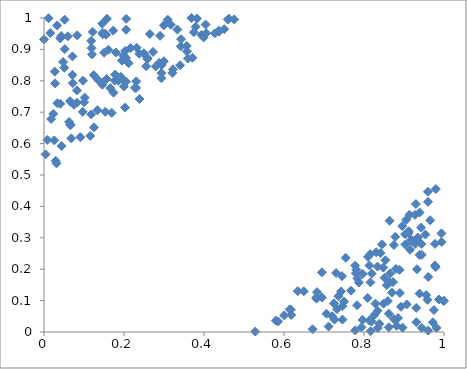
| Category | Series 0 |
|---|---|
| 0.8255359253217334 | 0.054 |
| -1.0 | -1 |
| -1.0 | -1 |
| -1.0 | -1 |
| -1.0 | -1 |
| -1.0 | -1 |
| -1.0 | -1 |
| 0.043009173144423984 | 0.943 |
| -1.0 | -1 |
| -1.0 | -1 |
| -1.0 | -1 |
| 0.8164118752493941 | 0.003 |
| -1.0 | -1 |
| 0.9032480513270551 | 0.279 |
| -1.0 | -1 |
| -1.0 | -1 |
| 0.06540548000652446 | 0.659 |
| -1.0 | -1 |
| -1.0 | -1 |
| -1.0 | -1 |
| -1.0 | -1 |
| -1.0 | -1 |
| -1.0 | -1 |
| 0.27939391772319966 | 0.846 |
| 0.14563416849404653 | 0.982 |
| -1.0 | -1 |
| 0.9306574972074495 | 0.077 |
| -1.0 | -1 |
| -1.0 | -1 |
| -1.0 | -1 |
| -1.0 | -1 |
| -1.0 | -1 |
| -1.0 | -1 |
| -1.0 | -1 |
| -1.0 | -1 |
| 0.39402318327530317 | 0.946 |
| -1.0 | -1 |
| 0.8746428690441705 | 0.041 |
| -1.0 | -1 |
| -1.0 | -1 |
| 0.8780425017900186 | 0.303 |
| -1.0 | -1 |
| -1.0 | -1 |
| -1.0 | -1 |
| 0.9443025398904694 | 0.246 |
| 0.881739866000679 | 0.02 |
| -1.0 | -1 |
| 0.05069709843471282 | 0.841 |
| -1.0 | -1 |
| -1.0 | -1 |
| 0.16576871503456592 | 0.777 |
| 0.9117610406502341 | 0.321 |
| -1.0 | -1 |
| -1.0 | -1 |
| -1.0 | -1 |
| -1.0 | -1 |
| -1.0 | -1 |
| -1.0 | -1 |
| -1.0 | -1 |
| -1.0 | -1 |
| -1.0 | -1 |
| 0.8964391469760449 | 0.014 |
| -1.0 | -1 |
| -1.0 | -1 |
| -1.0 | -1 |
| -1.0 | -1 |
| -1.0 | -1 |
| -1.0 | -1 |
| -1.0 | -1 |
| 0.19479838299463048 | 0.864 |
| -1.0 | -1 |
| 0.1730308627314714 | 0.96 |
| -1.0 | -1 |
| -1.0 | -1 |
| -1.0 | -1 |
| -1.0 | -1 |
| -1.0 | -1 |
| -1.0 | -1 |
| -1.0 | -1 |
| -1.0 | -1 |
| -1.0 | -1 |
| -1.0 | -1 |
| -1.0 | -1 |
| -1.0 | -1 |
| -1.0 | -1 |
| -1.0 | -1 |
| -1.0 | -1 |
| -1.0 | -1 |
| -1.0 | -1 |
| -1.0 | -1 |
| 0.3685224188958687 | 1 |
| -1.0 | -1 |
| 0.8955345021895946 | 0.337 |
| -1.0 | -1 |
| 0.00396515235492112 | 0.566 |
| -1.0 | -1 |
| -1.0 | -1 |
| 0.8889086364307159 | 0.198 |
| -1.0 | -1 |
| -1.0 | -1 |
| -1.0 | -1 |
| -1.0 | -1 |
| 0.18606198860519307 | 0.8 |
| 0.9934877384595246 | 0.314 |
| -1.0 | -1 |
| -1.0 | -1 |
| 0.9534184793362366 | 0.31 |
| -1.0 | -1 |
| -1.0 | -1 |
| -1.0 | -1 |
| -1.0 | -1 |
| -1.0 | -1 |
| 0.8132427247512573 | 0.037 |
| 0.15520126695969738 | 0.947 |
| -1.0 | -1 |
| 0.07372300051331626 | 0.726 |
| -1.0 | -1 |
| -1.0 | -1 |
| -1.0 | -1 |
| -1.0 | -1 |
| -1.0 | -1 |
| -1.0 | -1 |
| -1.0 | -1 |
| -1.0 | -1 |
| -1.0 | -1 |
| -1.0 | -1 |
| -1.0 | -1 |
| -1.0 | -1 |
| -1.0 | -1 |
| -1.0 | -1 |
| -1.0 | -1 |
| -1.0 | -1 |
| 0.7778610527372507 | 0.211 |
| -1.0 | -1 |
| -1.0 | -1 |
| 0.12489773113892699 | 0.652 |
| -1.0 | -1 |
| -1.0 | -1 |
| 0.2882715653145702 | 0.857 |
| -1.0 | -1 |
| -1.0 | -1 |
| -1.0 | -1 |
| -1.0 | -1 |
| 0.18920519381020595 | 0.804 |
| -1.0 | -1 |
| -1.0 | -1 |
| -1.0 | -1 |
| -1.0 | -1 |
| -1.0 | -1 |
| -1.0 | -1 |
| -1.0 | -1 |
| -1.0 | -1 |
| -1.0 | -1 |
| -1.0 | -1 |
| -1.0 | -1 |
| -1.0 | -1 |
| 0.3402747191488098 | 0.85 |
| -1.0 | -1 |
| -1.0 | -1 |
| -1.0 | -1 |
| -1.0 | -1 |
| -1.0 | -1 |
| -1.0 | -1 |
| -1.0 | -1 |
| -1.0 | -1 |
| 0.06489532293004885 | 0.735 |
| 0.9152704273472629 | 0.262 |
| 0.07111684465113921 | 0.819 |
| 0.7810111411751415 | 0.198 |
| -1.0 | -1 |
| 0.9435003015772141 | 0.28 |
| 0.8727521123040052 | 0.159 |
| -1.0 | -1 |
| 0.204939336731349 | 0.873 |
| 0.11581418679008104 | 0.625 |
| 0.9794280628973109 | 0.455 |
| -1.0 | -1 |
| -1.0 | -1 |
| -1.0 | -1 |
| -1.0 | -1 |
| -1.0 | -1 |
| 0.011304860166733821 | 0.999 |
| -1.0 | -1 |
| -1.0 | -1 |
| -1.0 | -1 |
| 0.8414668373654604 | 0.252 |
| -1.0 | -1 |
| 0.9391388847419431 | 0.381 |
| -1.0 | -1 |
| -1.0 | -1 |
| -1.0 | -1 |
| -1.0 | -1 |
| -1.0 | -1 |
| -1.0 | -1 |
| -1.0 | -1 |
| -1.0 | -1 |
| -1.0 | -1 |
| 0.37477566555972697 | 0.955 |
| 0.8336921301989797 | 0.208 |
| -1.0 | -1 |
| -1.0 | -1 |
| -1.0 | -1 |
| -1.0 | -1 |
| -1.0 | -1 |
| -1.0 | -1 |
| -1.0 | -1 |
| -1.0 | -1 |
| -1.0 | -1 |
| -1.0 | -1 |
| 0.6946987735963885 | 0.19 |
| -1.0 | -1 |
| -1.0 | -1 |
| -1.0 | -1 |
| 0.8339553074898127 | 0.067 |
| -1.0 | -1 |
| -1.0 | -1 |
| 0.9274862772767005 | 0.373 |
| -1.0 | -1 |
| -1.0 | -1 |
| -1.0 | -1 |
| -1.0 | -1 |
| -1.0 | -1 |
| -1.0 | -1 |
| -1.0 | -1 |
| -1.0 | -1 |
| -1.0 | -1 |
| 0.42697579692343446 | 0.951 |
| -1.0 | -1 |
| -1.0 | -1 |
| -1.0 | -1 |
| -1.0 | -1 |
| 0.3823107654467215 | 0.998 |
| -1.0 | -1 |
| 0.8383973170512524 | 0.026 |
| -1.0 | -1 |
| -1.0 | -1 |
| 0.14577978334024477 | 0.787 |
| -1.0 | -1 |
| -1.0 | -1 |
| 0.11810275844841822 | 0.693 |
| 0.25855494437174187 | 0.874 |
| -1.0 | -1 |
| -1.0 | -1 |
| 0.7937795830727383 | 0.015 |
| 0.16104514370522827 | 0.899 |
| -1.0 | -1 |
| -1.0 | -1 |
| -1.0 | -1 |
| 0.20302255121564183 | 0.895 |
| -1.0 | -1 |
| -1.0 | -1 |
| -1.0 | -1 |
| 0.238211186891637 | 0.886 |
| -1.0 | -1 |
| -1.0 | -1 |
| -1.0 | -1 |
| -1.0 | -1 |
| -1.0 | -1 |
| -1.0 | -1 |
| 0.3334892592455265 | 0.963 |
| -1.0 | -1 |
| -1.0 | -1 |
| 0.879962578920618 | 0.201 |
| 0.09685444831872614 | 0.701 |
| 0.7834100510101489 | 0.17 |
| -1.0 | -1 |
| -1.0 | -1 |
| -1.0 | -1 |
| -1.0 | -1 |
| -1.0 | -1 |
| -1.0 | -1 |
| -1.0 | -1 |
| -1.0 | -1 |
| -1.0 | -1 |
| -1.0 | -1 |
| -1.0 | -1 |
| -1.0 | -1 |
| -1.0 | -1 |
| -1.0 | -1 |
| -1.0 | -1 |
| -1.0 | -1 |
| 0.5852286284827777 | 0.034 |
| -1.0 | -1 |
| -1.0 | -1 |
| 0.19975987653984673 | 0.782 |
| -1.0 | -1 |
| -1.0 | -1 |
| -1.0 | -1 |
| -1.0 | -1 |
| -1.0 | -1 |
| 0.8570411835558094 | 0.149 |
| 0.9111200701835056 | 0.315 |
| -1.0 | -1 |
| -1.0 | -1 |
| -1.0 | -1 |
| -1.0 | -1 |
| -1.0 | -1 |
| 0.07494091043624396 | 0.724 |
| -1.0 | -1 |
| -1.0 | -1 |
| -1.0 | -1 |
| 0.4506421320639138 | 0.964 |
| 0.7778265660566588 | 0.005 |
| -1.0 | -1 |
| -1.0 | -1 |
| -1.0 | -1 |
| -1.0 | -1 |
| -1.0 | -1 |
| -1.0 | -1 |
| 0.1503177257202437 | 0.89 |
| -1.0 | -1 |
| -1.0 | -1 |
| -1.0 | -1 |
| 0.9941526374245395 | 0.287 |
| 0.37890189670716046 | 0.972 |
| -1.0 | -1 |
| 0.2049105972567511 | 0.797 |
| 0.9281396448241139 | 0.28 |
| -1.0 | -1 |
| 0.08231046268248865 | 0.769 |
| -1.0 | -1 |
| -1.0 | -1 |
| -1.0 | -1 |
| -1.0 | -1 |
| -1.0 | -1 |
| -1.0 | -1 |
| -1.0 | -1 |
| -1.0 | -1 |
| 0.5794780751692681 | 0.036 |
| -1.0 | -1 |
| -1.0 | -1 |
| -1.0 | -1 |
| -1.0 | -1 |
| -1.0 | -1 |
| -1.0 | -1 |
| -1.0 | -1 |
| -1.0 | -1 |
| 0.23056741628636246 | 0.798 |
| 0.7449419577818155 | 0.178 |
| -1.0 | -1 |
| -1.0 | -1 |
| 0.6714475108426692 | 0.009 |
| -1.0 | -1 |
| -1.0 | -1 |
| -1.0 | -1 |
| -1.0 | -1 |
| -1.0 | -1 |
| -1.0 | -1 |
| 0.16950391643711704 | 0.698 |
| -1.0 | -1 |
| -1.0 | -1 |
| -1.0 | -1 |
| 0.7425621731814784 | 0.129 |
| 0.3991742757075434 | 0.938 |
| -1.0 | -1 |
| -1.0 | -1 |
| 0.9183824143746451 | 0.294 |
| -1.0 | -1 |
| -1.0 | -1 |
| 0.754252043697963 | 0.236 |
| -1.0 | -1 |
| -1.0 | -1 |
| 0.9134960990707608 | 0.373 |
| 0.6006186959241964 | 0.053 |
| -1.0 | -1 |
| 0.23179550634821933 | 0.905 |
| 0.17771714088133406 | 0.82 |
| -1.0 | -1 |
| 0.9388576189557858 | 0.122 |
| -1.0 | -1 |
| -1.0 | -1 |
| -1.0 | -1 |
| -1.0 | -1 |
| -1.0 | -1 |
| 0.37104994469427677 | 0.873 |
| 0.8481428289582214 | 0.205 |
| 0.15644086167815474 | 0.806 |
| 0.7963588384566727 | 0.039 |
| -1.0 | -1 |
| -1.0 | -1 |
| -1.0 | -1 |
| -1.0 | -1 |
| 0.8516499930531218 | 0.173 |
| -1.0 | -1 |
| -1.0 | -1 |
| 0.040950726884403155 | 0.727 |
| -1.0 | -1 |
| -1.0 | -1 |
| 0.05143959658894115 | 0.995 |
| -1.0 | -1 |
| -1.0 | -1 |
| -1.0 | -1 |
| -1.0 | -1 |
| 0.4621325295219254 | 0.998 |
| -1.0 | -1 |
| -1.0 | -1 |
| -1.0 | -1 |
| 0.8595849178056165 | 0.098 |
| 0.8189425461002875 | 0.034 |
| -1.0 | -1 |
| -1.0 | -1 |
| -1.0 | -1 |
| -1.0 | -1 |
| -1.0 | -1 |
| -1.0 | -1 |
| -1.0 | -1 |
| -1.0 | -1 |
| 0.20526708608610456 | 0.963 |
| -1.0 | -1 |
| -1.0 | -1 |
| -1.0 | -1 |
| -1.0 | -1 |
| -1.0 | -1 |
| 0.979176126875215 | 0.207 |
| -1.0 | -1 |
| 0.2584566786253444 | 0.869 |
| -1.0 | -1 |
| -1.0 | -1 |
| 0.848854436947055 | 0.09 |
| -1.0 | -1 |
| -1.0 | -1 |
| -1.0 | -1 |
| -1.0 | -1 |
| -1.0 | -1 |
| -1.0 | -1 |
| 0.29412721051438306 | 0.85 |
| 0.17684557205700013 | 0.8 |
| 0.21168021146996896 | 0.856 |
| -1.0 | -1 |
| -1.0 | -1 |
| -1.0 | -1 |
| -1.0 | -1 |
| -1.0 | -1 |
| -1.0 | -1 |
| -1.0 | -1 |
| -1.0 | -1 |
| -1.0 | -1 |
| -1.0 | -1 |
| -1.0 | -1 |
| 0.9346557496366279 | 0.301 |
| -1.0 | -1 |
| -1.0 | -1 |
| -1.0 | -1 |
| -1.0 | -1 |
| 0.04056822320084663 | 0.935 |
| -1.0 | -1 |
| -1.0 | -1 |
| -1.0 | -1 |
| 0.02687302504944533 | 0.829 |
| -1.0 | -1 |
| -1.0 | -1 |
| 0.9586743304409124 | 0.102 |
| -1.0 | -1 |
| -1.0 | -1 |
| -1.0 | -1 |
| -1.0 | -1 |
| -1.0 | -1 |
| -1.0 | -1 |
| -1.0 | -1 |
| 0.8850800356384925 | 0.045 |
| 0.06838572021616773 | 0.617 |
| -1.0 | -1 |
| 0.8646525173764523 | 0.158 |
| 0.06688406228131694 | 0.66 |
| -1.0 | -1 |
| -1.0 | -1 |
| -1.0 | -1 |
| -1.0 | -1 |
| -1.0 | -1 |
| -1.0 | -1 |
| -1.0 | -1 |
| -1.0 | -1 |
| -1.0 | -1 |
| -1.0 | -1 |
| 0.74582669800009 | 0.083 |
| -1.0 | -1 |
| 0.7301684626796154 | 0.188 |
| -1.0 | -1 |
| -1.0 | -1 |
| -1.0 | -1 |
| -1.0 | -1 |
| -1.0 | -1 |
| -1.0 | -1 |
| -1.0 | -1 |
| -1.0 | -1 |
| -1.0 | -1 |
| -1.0 | -1 |
| -1.0 | -1 |
| 0.3222211924164413 | 0.836 |
| -1.0 | -1 |
| -1.0 | -1 |
| 0.7062133575677623 | 0.058 |
| -1.0 | -1 |
| -1.0 | -1 |
| -1.0 | -1 |
| -1.0 | -1 |
| -1.0 | -1 |
| 0.12008856975966964 | 0.884 |
| -1.0 | -1 |
| 0.9874799503133578 | 0.104 |
| -1.0 | -1 |
| 0.1527180337104297 | 0.95 |
| 0.11786424162476639 | 0.927 |
| 0.6811362062669974 | 0.11 |
| -1.0 | -1 |
| 0.27271477402076894 | 0.892 |
| 0.8640067113674903 | 0.354 |
| -1.0 | -1 |
| -1.0 | -1 |
| -1.0 | -1 |
| -1.0 | -1 |
| 0.8924284961902411 | 0.08 |
| 0.8748622343688224 | 0.277 |
| -1.0 | -1 |
| -1.0 | -1 |
| -1.0 | -1 |
| 0.04765673780918167 | 0.86 |
| -1.0 | -1 |
| -1.0 | -1 |
| -1.0 | -1 |
| 0.9428733470917323 | 0.332 |
| -1.0 | -1 |
| -1.0 | -1 |
| -1.0 | -1 |
| -1.0 | -1 |
| -1.0 | -1 |
| -1.0 | -1 |
| -1.0 | -1 |
| -1.0 | -1 |
| -1.0 | -1 |
| 0.24966833761768403 | 0.888 |
| -1.0 | -1 |
| -1.0 | -1 |
| -1.0 | -1 |
| -1.0 | -1 |
| 0.023012625383297625 | 0.695 |
| -1.0 | -1 |
| -1.0 | -1 |
| -1.0 | -1 |
| -1.0 | -1 |
| 0.8345874624729781 | 0.013 |
| 0.7261935373081227 | 0.039 |
| -1.0 | -1 |
| -1.0 | -1 |
| -1.0 | -1 |
| -1.0 | -1 |
| -1.0 | -1 |
| -1.0 | -1 |
| -1.0 | -1 |
| -1.0 | -1 |
| -1.0 | -1 |
| -1.0 | -1 |
| 0.3574206633095627 | 0.894 |
| -1.0 | -1 |
| -1.0 | -1 |
| -1.0 | -1 |
| -1.0 | -1 |
| -1.0 | -1 |
| 0.6143265979911645 | 0.072 |
| -1.0 | -1 |
| -1.0 | -1 |
| -1.0 | -1 |
| 0.9598521789983763 | 0.447 |
| -1.0 | -1 |
| -1.0 | -1 |
| -1.0 | -1 |
| 0.9308485737883598 | 0.031 |
| -1.0 | -1 |
| -1.0 | -1 |
| -1.0 | -1 |
| -1.0 | -1 |
| 0.9388798783211891 | 0.246 |
| -1.0 | -1 |
| -1.0 | -1 |
| 0.35953264785208566 | 0.871 |
| -1.0 | -1 |
| -1.0 | -1 |
| -1.0 | -1 |
| -1.0 | -1 |
| -1.0 | -1 |
| 0.7323560700948599 | 0.073 |
| 0.027763214054153273 | 0.792 |
| -1.0 | -1 |
| -1.0 | -1 |
| -1.0 | -1 |
| -1.0 | -1 |
| 0.9600715777174511 | 0.415 |
| -1.0 | -1 |
| -1.0 | -1 |
| -1.0 | -1 |
| 0.2646322793315701 | 0.949 |
| -1.0 | -1 |
| 0.07113640619290718 | 0.878 |
| 0.0822677552647395 | 0.73 |
| -1.0 | -1 |
| -1.0 | -1 |
| -1.0 | -1 |
| -1.0 | -1 |
| -1.0 | -1 |
| -1.0 | -1 |
| -1.0 | -1 |
| 0.23874658998815423 | 0.742 |
| -1.0 | -1 |
| -1.0 | -1 |
| 0.4370640267146888 | 0.96 |
| -1.0 | -1 |
| 0.9555233874749796 | 0.118 |
| -1.0 | -1 |
| 0.03113454789644199 | 0.537 |
| -1.0 | -1 |
| 0.1017304747408736 | 0.746 |
| -1.0 | -1 |
| -1.0 | -1 |
| -1.0 | -1 |
| -1.0 | -1 |
| 0.9029854184210597 | 0.311 |
| -1.0 | -1 |
| -1.0 | -1 |
| -1.0 | -1 |
| -1.0 | -1 |
| -1.0 | -1 |
| -1.0 | -1 |
| 0.7797084253536781 | 0.187 |
| -1.0 | -1 |
| 0.9605420665751305 | 0.005 |
| 0.09747782273047867 | 0.8 |
| 0.6168020715700353 | 0.071 |
| 0.4594765969326531 | 0.995 |
| 0.2902287824746801 | 0.943 |
| -1.0 | -1 |
| -1.0 | -1 |
| -1.0 | -1 |
| -1.0 | -1 |
| -1.0 | -1 |
| -1.0 | -1 |
| -1.0 | -1 |
| 0.6345084766040774 | 0.13 |
| -1.0 | -1 |
| -1.0 | -1 |
| -1.0 | -1 |
| 0.7827128865170279 | 0.085 |
| -1.0 | -1 |
| 0.9721658937026252 | 0.031 |
| -1.0 | -1 |
| 0.025737310360779198 | 0.61 |
| -1.0 | -1 |
| -1.0 | -1 |
| -1.0 | -1 |
| 0.2554707678587307 | 0.846 |
| -1.0 | -1 |
| -1.0 | -1 |
| -1.0 | -1 |
| -1.0 | -1 |
| -1.0 | -1 |
| -1.0 | -1 |
| -1.0 | -1 |
| 0.14705967242826423 | 0.948 |
| -1.0 | -1 |
| -1.0 | -1 |
| -1.0 | -1 |
| 0.15313899072912474 | 0.701 |
| 0.13350103323083662 | 0.706 |
| -1.0 | -1 |
| -1.0 | -1 |
| 0.07190341245067433 | 0.792 |
| -1.0 | -1 |
| -1.0 | -1 |
| 0.033450395913003694 | 0.729 |
| 0.05175009302116074 | 0.901 |
| -1.0 | -1 |
| 0.15742013578602698 | 0.998 |
| -1.0 | -1 |
| -1.0 | -1 |
| -1.0 | -1 |
| -1.0 | -1 |
| -1.0 | -1 |
| 0.7870310522323551 | 0.158 |
| -1.0 | -1 |
| -1.0 | -1 |
| 0.2936179236227039 | 0.808 |
| -1.0 | -1 |
| -1.0 | -1 |
| 0.724856123861171 | 0.091 |
| -1.0 | -1 |
| -1.0 | -1 |
| -1.0 | -1 |
| 0.0002173461356067552 | 0.932 |
| -1.0 | -1 |
| -1.0 | -1 |
| -1.0 | -1 |
| -1.0 | -1 |
| -1.0 | -1 |
| -1.0 | -1 |
| -1.0 | -1 |
| -1.0 | -1 |
| 0.3171464681160434 | 0.978 |
| 0.3427205284003618 | 0.933 |
| -1.0 | -1 |
| -1.0 | -1 |
| -1.0 | -1 |
| -1.0 | -1 |
| -1.0 | -1 |
| 0.02933856290094239 | 0.545 |
| 0.917214705952127 | 0.29 |
| -1.0 | -1 |
| 0.00827149120599735 | 0.612 |
| -1.0 | -1 |
| 0.20269261851666265 | 0.715 |
| -1.0 | -1 |
| 0.977338732590874 | 0.281 |
| -1.0 | -1 |
| -1.0 | -1 |
| 0.08280976186236444 | 0.945 |
| -1.0 | -1 |
| 0.059518255030456935 | 0.942 |
| -1.0 | -1 |
| 0.7115131336936662 | 0.018 |
| -1.0 | -1 |
| -1.0 | -1 |
| -1.0 | -1 |
| -1.0 | -1 |
| -1.0 | -1 |
| 0.32079219759306227 | 0.825 |
| -1.0 | -1 |
| -1.0 | -1 |
| -1.0 | -1 |
| -1.0 | -1 |
| -1.0 | -1 |
| -1.0 | -1 |
| -1.0 | -1 |
| -1.0 | -1 |
| 0.694854883925835 | 0.11 |
| 0.23023490765048304 | 0.777 |
| -1.0 | -1 |
| -1.0 | -1 |
| -1.0 | -1 |
| 0.9654865917991278 | 0.356 |
| -1.0 | -1 |
| -1.0 | -1 |
| -1.0 | -1 |
| -1.0 | -1 |
| 0.816022375073624 | 0.158 |
| -1.0 | -1 |
| 0.13497898260351815 | 0.803 |
| -1.0 | -1 |
| 0.29350852268322125 | 0.825 |
| -1.0 | -1 |
| -1.0 | -1 |
| 0.17398411921089085 | 0.762 |
| -1.0 | -1 |
| -1.0 | -1 |
| -1.0 | -1 |
| -1.0 | -1 |
| -1.0 | -1 |
| 0.5280703629640109 | 0.001 |
| 0.14607339977091027 | 0.953 |
| -1.0 | -1 |
| -1.0 | -1 |
| -1.0 | -1 |
| -1.0 | -1 |
| -1.0 | -1 |
| -1.0 | -1 |
| 0.8192587421822373 | 0.186 |
| -1.0 | -1 |
| -1.0 | -1 |
| -1.0 | -1 |
| -1.0 | -1 |
| 0.40397405687617405 | 0.979 |
| -1.0 | -1 |
| 0.04401286895897227 | 0.592 |
| -1.0 | -1 |
| -1.0 | -1 |
| -1.0 | -1 |
| 0.809990970652021 | 0.239 |
| 0.8619116101071489 | 0.015 |
| -1.0 | -1 |
| 0.06276489579280842 | 0.669 |
| 0.7360423002984353 | 0.114 |
| -1.0 | -1 |
| -1.0 | -1 |
| -1.0 | -1 |
| 0.9606003035199326 | 0.175 |
| -1.0 | -1 |
| -1.0 | -1 |
| -1.0 | -1 |
| 0.9296541663659337 | 0.407 |
| -1.0 | -1 |
| -1.0 | -1 |
| 0.9813471048351889 | 0.013 |
| 0.09086520031369383 | 0.621 |
| -1.0 | -1 |
| 0.8619709149860335 | 0.058 |
| 0.12448389373098578 | 0.818 |
| 0.9054762170543815 | 0.357 |
| -1.0 | -1 |
| -1.0 | -1 |
| -1.0 | -1 |
| -1.0 | -1 |
| -1.0 | -1 |
| -1.0 | -1 |
| 0.032866034594203786 | 0.976 |
| -1.0 | -1 |
| -1.0 | -1 |
| -1.0 | -1 |
| -1.0 | -1 |
| 0.6493215161377837 | 0.13 |
| 0.8286183945152477 | 0.09 |
| 0.9068260265440149 | 0.088 |
| -1.0 | -1 |
| -1.0 | -1 |
| 0.10017791509642704 | 0.732 |
| -1.0 | -1 |
| -1.0 | -1 |
| 0.6825388220718953 | 0.127 |
| 0.12157755128880954 | 0.956 |
| -1.0 | -1 |
| -1.0 | -1 |
| -1.0 | -1 |
| -1.0 | -1 |
| 0.22743277368753922 | 0.778 |
| -1.0 | -1 |
| 0.20553623524313291 | 0.997 |
| -1.0 | -1 |
| -1.0 | -1 |
| -1.0 | -1 |
| 0.4378482477486316 | 0.957 |
| -1.0 | -1 |
| -1.0 | -1 |
| -1.0 | -1 |
| -1.0 | -1 |
| -1.0 | -1 |
| -1.0 | -1 |
| -1.0 | -1 |
| 0.9444313937786788 | 0.013 |
| -1.0 | -1 |
| -1.0 | -1 |
| -1.0 | -1 |
| -1.0 | -1 |
| -1.0 | -1 |
| -1.0 | -1 |
| 0.8657043377677072 | 0.187 |
| 0.9324331815708258 | 0.2 |
| -1.0 | -1 |
| -1.0 | -1 |
| -1.0 | -1 |
| -1.0 | -1 |
| -1.0 | -1 |
| -1.0 | -1 |
| 0.8092634181738809 | 0.108 |
| -1.0 | -1 |
| -1.0 | -1 |
| -1.0 | -1 |
| -1.0 | -1 |
| -1.0 | -1 |
| -1.0 | -1 |
| -1.0 | -1 |
| -1.0 | -1 |
| -1.0 | -1 |
| -1.0 | -1 |
| -1.0 | -1 |
| -1.0 | -1 |
| 0.720576360148729 | 0.05 |
| -1.0 | -1 |
| -1.0 | -1 |
| -1.0 | -1 |
| 0.9999779530437642 | 0.099 |
| -1.0 | -1 |
| -1.0 | -1 |
| -1.0 | -1 |
| 0.9748115100945594 | 0.07 |
| -1.0 | -1 |
| -1.0 | -1 |
| -1.0 | -1 |
| -1.0 | -1 |
| -1.0 | -1 |
| 0.6812060022992821 | 0.106 |
| -1.0 | -1 |
| -1.0 | -1 |
| -1.0 | -1 |
| 0.30915709606602304 | 0.995 |
| -1.0 | -1 |
| -1.0 | -1 |
| 0.9989648006467093 | 0.099 |
| -1.0 | -1 |
| -1.0 | -1 |
| -1.0 | -1 |
| 0.8898359365072877 | 0.124 |
| 0.34183692515855846 | 0.91 |
| -1.0 | -1 |
| -1.0 | -1 |
| 0.8135888655103498 | 0.212 |
| 0.015806086294681165 | 0.952 |
| -1.0 | -1 |
| 0.40559586024744054 | 0.952 |
| -1.0 | -1 |
| -1.0 | -1 |
| -1.0 | -1 |
| -1.0 | -1 |
| 0.8155720500769608 | 0.248 |
| -1.0 | -1 |
| -1.0 | -1 |
| -1.0 | -1 |
| -1.0 | -1 |
| -1.0 | -1 |
| -1.0 | -1 |
| -1.0 | -1 |
| -1.0 | -1 |
| -1.0 | -1 |
| -1.0 | -1 |
| -1.0 | -1 |
| -1.0 | -1 |
| -1.0 | -1 |
| -1.0 | -1 |
| -1.0 | -1 |
| -1.0 | -1 |
| -1.0 | -1 |
| 0.3567815169612798 | 0.911 |
| -1.0 | -1 |
| 0.6180770990239015 | 0.054 |
| -1.0 | -1 |
| -1.0 | -1 |
| -1.0 | -1 |
| -1.0 | -1 |
| -1.0 | -1 |
| -1.0 | -1 |
| -1.0 | -1 |
| 0.19826366949113083 | 0.88 |
| -1.0 | -1 |
| -1.0 | -1 |
| 0.47554676163022425 | 0.995 |
| -1.0 | -1 |
| -1.0 | -1 |
| -1.0 | -1 |
| -1.0 | -1 |
| -1.0 | -1 |
| -1.0 | -1 |
| -1.0 | -1 |
| -1.0 | -1 |
| 0.7500883126877254 | 0.097 |
| -1.0 | -1 |
| -1.0 | -1 |
| -1.0 | -1 |
| -1.0 | -1 |
| -1.0 | -1 |
| -1.0 | -1 |
| -1.0 | -1 |
| 0.21613740613779542 | 0.904 |
| 0.7462012122029424 | 0.04 |
| -1.0 | -1 |
| -1.0 | -1 |
| -1.0 | -1 |
| -1.0 | -1 |
| -1.0 | -1 |
| -1.0 | -1 |
| 0.7966648014982014 | 0.185 |
| -1.0 | -1 |
| -1.0 | -1 |
| -1.0 | -1 |
| -1.0 | -1 |
| -1.0 | -1 |
| -1.0 | -1 |
| 0.8449315327327653 | 0.279 |
| -1.0 | -1 |
| -1.0 | -1 |
| -1.0 | -1 |
| -1.0 | -1 |
| -1.0 | -1 |
| -1.0 | -1 |
| 0.29976930926233814 | 0.977 |
| -1.0 | -1 |
| -1.0 | -1 |
| -1.0 | -1 |
| -1.0 | -1 |
| -1.0 | -1 |
| -1.0 | -1 |
| -1.0 | -1 |
| 0.8305067331267457 | 0.254 |
| -1.0 | -1 |
| -1.0 | -1 |
| 0.8699314583554332 | 0.125 |
| -1.0 | -1 |
| 0.7676050772898257 | 0.132 |
| -1.0 | -1 |
| -1.0 | -1 |
| -1.0 | -1 |
| 0.8534789588911931 | 0.229 |
| 0.8172558580961349 | 0.035 |
| 0.11875803697059073 | 0.904 |
| -1.0 | -1 |
| -1.0 | -1 |
| 0.01783425135702643 | 0.678 |
| 0.1921370398033364 | 0.813 |
| -1.0 | -1 |
| 0.17976374199249268 | 0.89 |
| -1.0 | -1 |
| 0.9774349039477563 | 0.212 |
| -1.0 | -1 |
| -1.0 | -1 |
| -1.0 | -1 |
| 0.2994471710090476 | 0.862 |